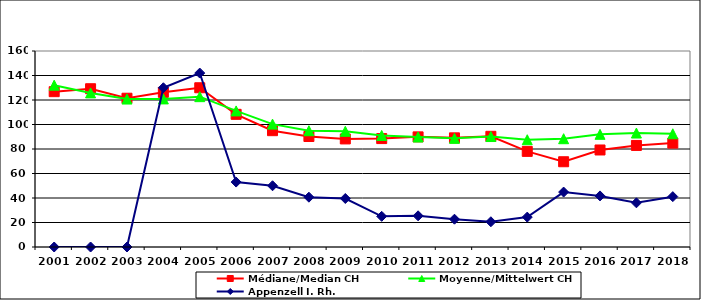
| Category | Médiane/Median CH | Moyenne/Mittelwert CH | Appenzell I. Rh. |
|---|---|---|---|
| 2001.0 | 126.8 | 132.1 | 0 |
| 2002.0 | 129.2 | 125.8 | 0 |
| 2003.0 | 121.45 | 120.775 | 0 |
| 2004.0 | 126.25 | 120.889 | 130 |
| 2005.0 | 130 | 122.728 | 142 |
| 2006.0 | 108.3 | 111.087 | 53 |
| 2007.0 | 94.96 | 100.307 | 50 |
| 2008.0 | 90.2 | 94.911 | 40.67 |
| 2009.0 | 88.22 | 94.453 | 39.6 |
| 2010.0 | 88.5 | 91.058 | 25.05 |
| 2011.0 | 89.9 | 89.805 | 25.45 |
| 2012.0 | 89.11 | 88.689 | 22.68 |
| 2013.0 | 90.35 | 90.167 | 20.6 |
| 2014.0 | 78.06 | 87.587 | 24.41 |
| 2015.0 | 69.6 | 88.398 | 44.84 |
| 2016.0 | 79.2 | 91.977 | 41.7 |
| 2017.0 | 82.9 | 93.027 | 36.06 |
| 2018.0 | 84.8 | 92.448 | 41.11 |